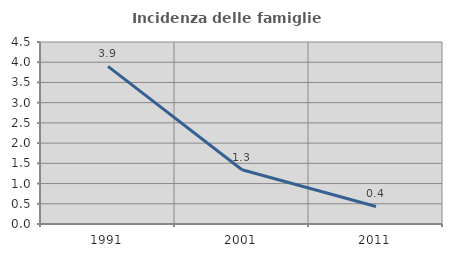
| Category | Incidenza delle famiglie numerose |
|---|---|
| 1991.0 | 3.898 |
| 2001.0 | 1.341 |
| 2011.0 | 0.433 |